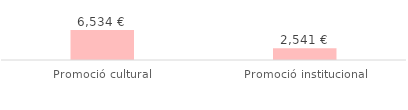
| Category | Total |
|---|---|
| Promoció cultural | 6534 |
| Promoció institucional | 2541 |